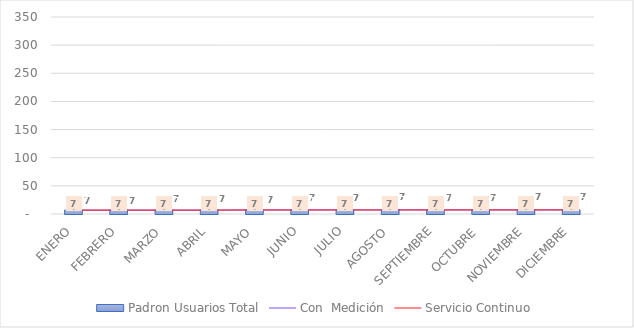
| Category | Padron Usuarios Total |
|---|---|
| ENERO | 6.897 |
| FEBRERO | 6.906 |
| MARZO | 6.92 |
| ABRIL | 6.928 |
| MAYO | 7.187 |
| JUNIO | 7.2 |
| JULIO | 7.203 |
| AGOSTO | 7.21 |
| SEPTIEMBRE | 7.22 |
| OCTUBRE | 7.234 |
| NOVIEMBRE | 7.233 |
| DICIEMBRE | 7.239 |